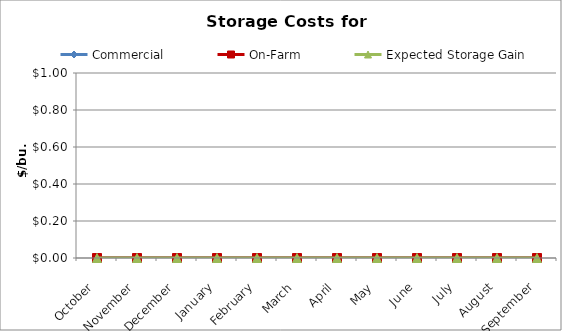
| Category | Commercial | On-Farm | Expected Storage Gain |
|---|---|---|---|
| October | 0 | 0 | 0 |
| November | 0 | 0 | 0 |
| December | 0 | 0 | 0 |
| January | 0 | 0 | 0 |
| February | 0 | 0 | 0 |
| March | 0 | 0 | 0 |
| April | 0 | 0 | 0 |
| May | 0 | 0 | 0 |
| June | 0 | 0 | 0 |
| July | 0 | 0 | 0 |
| August | 0 | 0 | 0 |
| September | 0 | 0 | 0 |